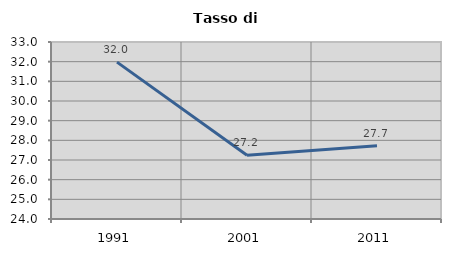
| Category | Tasso di disoccupazione   |
|---|---|
| 1991.0 | 31.975 |
| 2001.0 | 27.238 |
| 2011.0 | 27.727 |